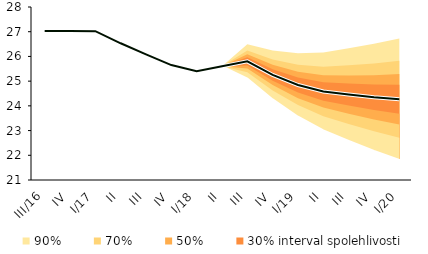
| Category | linka | Centerline |
|---|---|---|
| 0 | 27.028 | 27.028 |
| 1 | 27.028 | 27.028 |
| 2 | 27.02 | 27.02 |
| 3 | 26.532 | 26.532 |
| 4 | 26.084 | 26.084 |
| 5 | 25.651 | 25.651 |
| 6 | 25.402 | 25.402 |
| 7 | 25.599 | 25.599 |
| 8 | 25.8 | 25.8 |
| 9 | 25.25 | 25.25 |
| 10 | 24.844 | 24.844 |
| 11 | 24.583 | 24.583 |
| 12 | 24.456 | 24.456 |
| 13 | 24.345 | 24.345 |
| 14 | 24.27 | 24.27 |